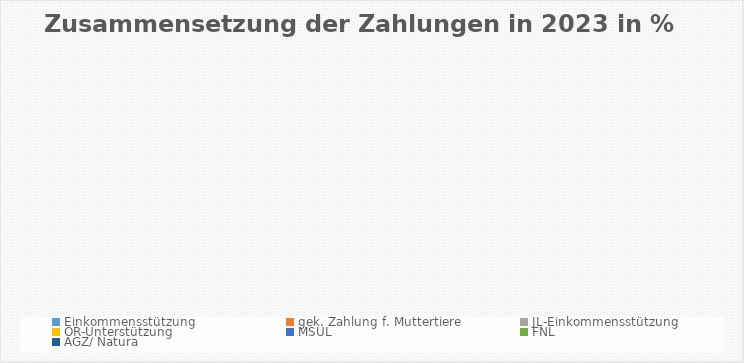
| Category | Series 0 |
|---|---|
| Einkommensstützung | 0 |
| gek. Zahlung f. Muttertiere | 0 |
| JL-Einkommensstützung | 0 |
| ÖR-Unterstützung | 0 |
| MSUL  | 0 |
| FNL | 0 |
| AGZ/ Natura | 0 |